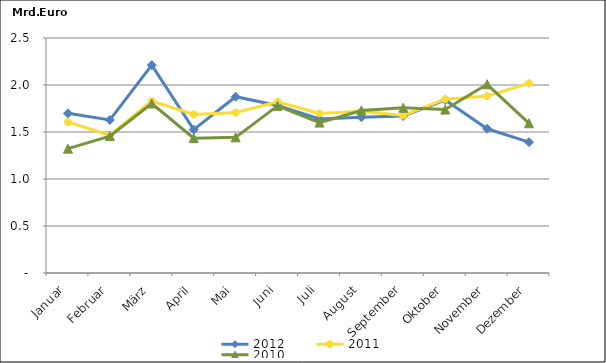
| Category | 2012 | 2011 | 2010 |
|---|---|---|---|
| Januar | 1.699 | 1.604 | 1.323 |
| Februar | 1.628 | 1.465 | 1.456 |
| März | 2.211 | 1.83 | 1.803 |
| April | 1.526 | 1.687 | 1.435 |
| Mai | 1.875 | 1.707 | 1.443 |
| Juni | 1.782 | 1.821 | 1.778 |
| Juli | 1.639 | 1.698 | 1.6 |
| August | 1.658 | 1.721 | 1.729 |
| September | 1.67 | 1.676 | 1.758 |
| Oktober | 1.84 | 1.849 | 1.739 |
| November | 1.534 | 1.882 | 2.008 |
| Dezember | 1.392 | 2.019 | 1.593 |